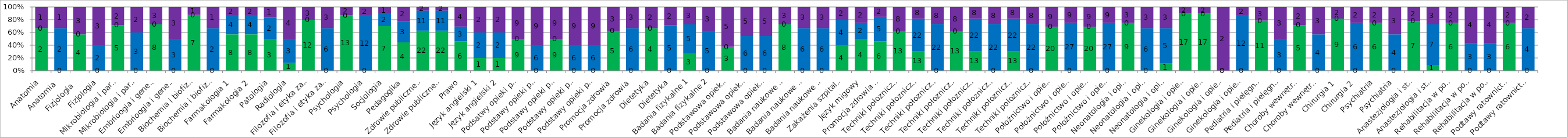
| Category | Wiedza | Umiejętności | Kompetencje społeczne |
|---|---|---|---|
| Anatomia | 2 | 0 | 1 |
| Anatomia   | 0 | 2 | 1 |
| Fizjologia   | 4 | 0 | 3 |
| Fizjologia | 0 | 2 | 3 |
| Mikrobiologia i parazytologia | 5 | 0 | 2 |
| Mikrobiologia i parazytologia | 0 | 3 | 2 |
| Embrioogia i genetyka | 8 | 0 | 3 |
| Embrioogia i genetyka | 0 | 3 | 3 |
| Biochemia i biofizyka | 7 | 0 | 1 |
| Biochemia i biofizyka | 0 | 2 | 1 |
| Farmakologia 1 | 8 | 4 | 2 |
| Farmakologia 2 | 8 | 4 | 2 |
| Patologia | 3 | 2 | 1 |
| Radiologia | 1 | 3 | 4 |
| Filozofia i etyka zawodu położnej | 12 | 0 | 3 |
| Filozofia i etyka zawodu położnej | 0 | 6 | 3 |
| Psychologia | 13 | 0 | 2 |
| Psychologia | 0 | 12 | 2 |
| Socjologia | 7 | 2 | 1 |
| Pedagogika | 4 | 3 | 2 |
| Zdrowie publiczne 1 | 22 | 11 | 2 |
| Zdrowie publiczne 2 | 22 | 11 | 2 |
| Prawo | 6 | 3 | 4 |
| Język angielski 1 | 1 | 2 | 2 |
| Język angielski 2 | 1 | 2 | 2 |
| Podsatwy opieki położniczej 1 | 9 | 0 | 9 |
| Podstawy opieki połozniczej 1 | 0 | 6 | 9 |
| Podstawy opieki połozniczej 2 | 9 | 0 | 9 |
| Podstawy opieki połozniczej 2 | 0 | 6 | 9 |
| Podstawy opieki połozniczej 2 | 0 | 6 | 9 |
| Promocja zdrowia | 5 | 0 | 3 |
| Promocja zdrowia | 0 | 6 | 3 |
| Dietetyka | 4 | 0 | 2 |
| Dietetyka | 0 | 5 | 2 |
| Badania fizykalne 1 | 3 | 5 | 3 |
| Badania fizykalne 2 | 0 | 5 | 3 |
| Podstawowa opieka zdrowotna | 3 | 0 | 5 |
| Podstawowa opieka zdrowotna | 0 | 6 | 5 |
| Podstawowa opieka zdrowotna | 0 | 6 | 5 |
| Badania naukowe w położnictwie 1 | 8 | 0 | 3 |
| Badania naukowe w położnictwie 1 | 0 | 6 | 3 |
| Badania naukowe w położnictwie 2 | 0 | 6 | 3 |
| Zakażenia szpitalne | 4 | 4 | 2 |
| Język migowy | 4 | 2 | 2 |
| Promocja zdrowia psychicznego | 6 | 5 | 2 |
| Techniki połoznicze i prowadzenie porodu 1 | 13 | 0 | 8 |
| Techniki połoznicze i prowadzenie porodu 1 | 13 | 22 | 8 |
| Techniki połoznicze i prowadzenie porodu 1 | 0 | 22 | 8 |
| Techniki połoznicze i prowadzenie porodu 2 | 13 | 0 | 8 |
| Techniki połoznicze i prowadzenie porodu 2 | 13 | 22 | 8 |
| Techniki połoznicze i prowadzenie porodu 2 | 0 | 22 | 8 |
| Techniki połoznicze i prowadzenie porodu 3 | 13 | 22 | 8 |
| Techniki połoznicze i prowadzenie porodu 3 | 0 | 22 | 8 |
| Położnictwo i opieka położnicza 1 | 20 | 0 | 9 |
| Położnictwo i opieka położnicza 1 | 0 | 27 | 9 |
| Położnictwo i opieka położnicza 2 | 20 | 0 | 9 |
| Położnictwo i opieka położnicza 2 | 0 | 27 | 9 |
| Neonatologia i opieka neonatologiczna 1 | 9 | 0 | 3 |
| Neonatologia i opieka neonatologiczna 1 | 0 | 6 | 3 |
| Neonatologia i opieka neonatologiczna 2 | 1 | 5 | 3 |
| Ginekologia i opieka ginekologiczna 1 | 17 | 0 | 2 |
| Ginekologia i opieka ginekologiczna 2 | 17 | 0 | 2 |
| Ginekologia i opieka ginekologiczna 2 | 0 | 0 | 2 |
| Ginekologia i opieka ginekologiczna 2 | 0 | 12 | 2 |
| Pediatria i pielęgniarstwo pediatryczne | 11 | 0 | 3 |
| Pediatria i pielęgniarstwo pediatryczne | 0 | 3 | 3 |
| Choroby wewnętrzne 1 | 5 | 0 | 2 |
| Choroby wewnętrzne 2 | 0 | 4 | 3 |
| Chirurgia 1 | 9 | 0 | 2 |
| Chirurgia 2 | 0 | 6 | 2 |
| Psychiatria | 6 | 0 | 2 |
| Psychiatria | 0 | 4 | 3 |
| Anastezjologia i stany zagrożenia zycia | 7 | 0 | 2 |
| Anastezjologia i stany zagrożenia zycia | 1 | 7 | 3 |
| Rehabilitacja w położnictwie, neonatologii i ginekologii | 6 | 0 | 2 |
| Rehabilitacja w położnictwie, neonatologii i ginekologii | 0 | 3 | 4 |
| Rehabilitacja w położnictwie, neonatologii i ginekologii | 0 | 3 | 4 |
| Podtawy ratownictwa medycznego | 6 | 0 | 2 |
| Podtawy ratownictwa medycznego | 0 | 4 | 2 |